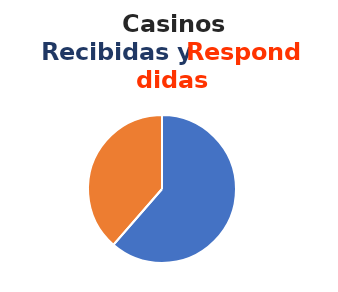
| Category | Series 0 |
|---|---|
| 0 | 35 |
| 1 | 22 |